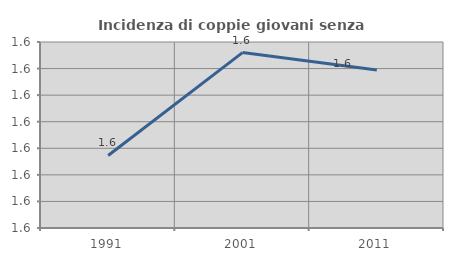
| Category | Incidenza di coppie giovani senza figli |
|---|---|
| 1991.0 | 1.587 |
| 2001.0 | 1.626 |
| 2011.0 | 1.619 |